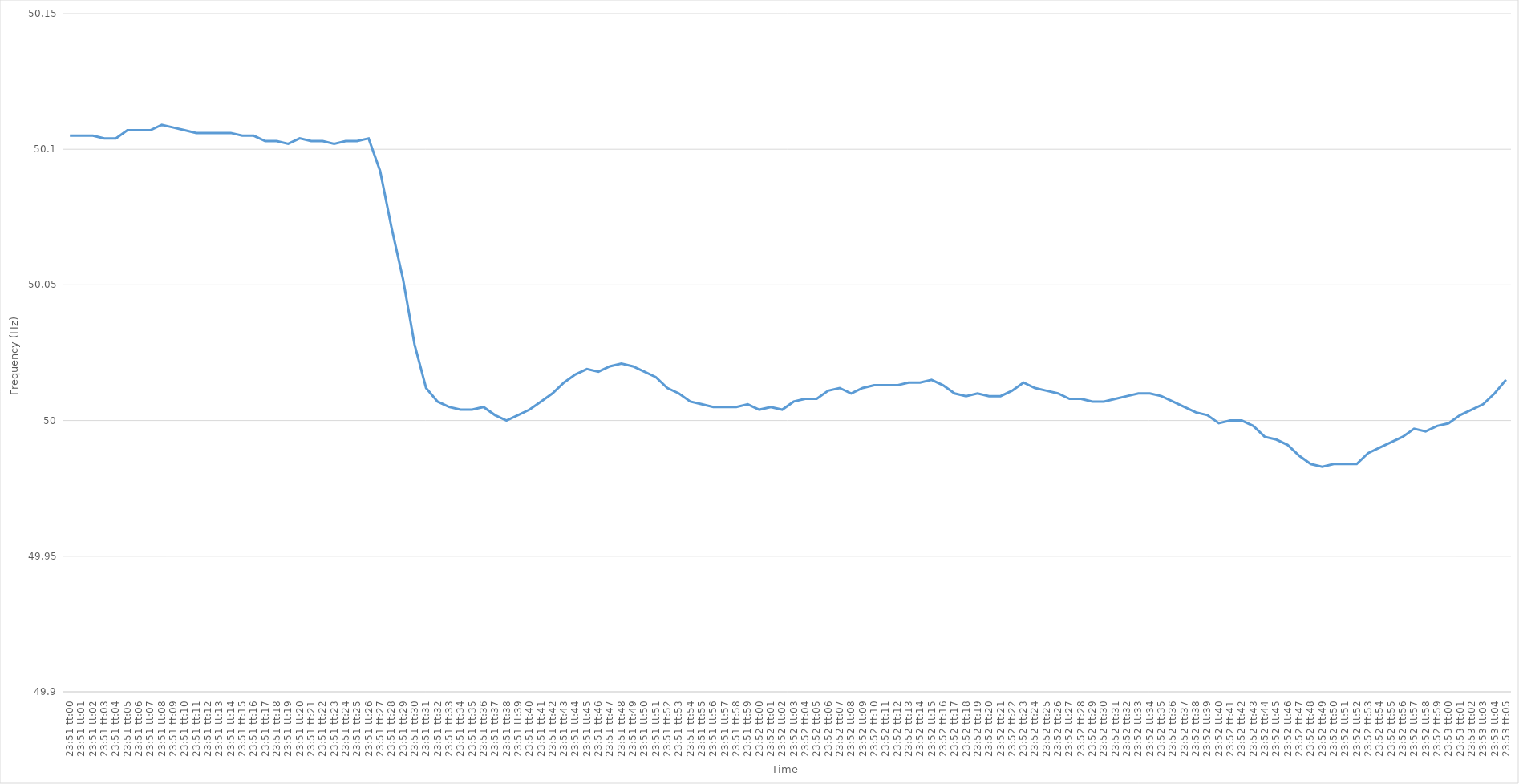
| Category | Series 0 |
|---|---|
| 0.99375 | 50.105 |
| 0.9937615740740741 | 50.105 |
| 0.9937731481481481 | 50.105 |
| 0.9937847222222222 | 50.104 |
| 0.9937962962962964 | 50.104 |
| 0.9938078703703703 | 50.107 |
| 0.9938194444444445 | 50.107 |
| 0.9938310185185185 | 50.107 |
| 0.9938425925925927 | 50.109 |
| 0.9938541666666666 | 50.108 |
| 0.9938657407407407 | 50.107 |
| 0.9938773148148149 | 50.106 |
| 0.9938888888888888 | 50.106 |
| 0.993900462962963 | 50.106 |
| 0.993912037037037 | 50.106 |
| 0.9939236111111112 | 50.105 |
| 0.9939351851851851 | 50.105 |
| 0.9939467592592592 | 50.103 |
| 0.9939583333333334 | 50.103 |
| 0.9939699074074074 | 50.102 |
| 0.9939814814814815 | 50.104 |
| 0.9939930555555555 | 50.103 |
| 0.9940046296296297 | 50.103 |
| 0.9940162037037038 | 50.102 |
| 0.9940277777777777 | 50.103 |
| 0.9940393518518519 | 50.103 |
| 0.9940509259259259 | 50.104 |
| 0.9940625000000001 | 50.092 |
| 0.994074074074074 | 50.071 |
| 0.9940856481481481 | 50.052 |
| 0.9940972222222223 | 50.028 |
| 0.9941087962962962 | 50.012 |
| 0.9941203703703704 | 50.007 |
| 0.9941319444444444 | 50.005 |
| 0.9941435185185186 | 50.004 |
| 0.9941550925925925 | 50.004 |
| 0.9941666666666666 | 50.005 |
| 0.9941782407407408 | 50.002 |
| 0.9941898148148148 | 50 |
| 0.9942013888888889 | 50.002 |
| 0.9942129629629629 | 50.004 |
| 0.9942245370370371 | 50.007 |
| 0.9942361111111112 | 50.01 |
| 0.9942476851851851 | 50.014 |
| 0.9942592592592593 | 50.017 |
| 0.9942708333333333 | 50.019 |
| 0.9942824074074075 | 50.018 |
| 0.9942939814814814 | 50.02 |
| 0.9943055555555556 | 50.021 |
| 0.9943171296296297 | 50.02 |
| 0.9943287037037036 | 50.018 |
| 0.9943402777777778 | 50.016 |
| 0.9943518518518518 | 50.012 |
| 0.994363425925926 | 50.01 |
| 0.9943749999999999 | 50.007 |
| 0.994386574074074 | 50.006 |
| 0.9943981481481482 | 50.005 |
| 0.9944097222222222 | 50.005 |
| 0.9944212962962963 | 50.005 |
| 0.9944328703703703 | 50.006 |
| 0.9944444444444445 | 50.004 |
| 0.9944560185185186 | 50.005 |
| 0.9944675925925925 | 50.004 |
| 0.9944791666666667 | 50.007 |
| 0.9944907407407407 | 50.008 |
| 0.9945023148148149 | 50.008 |
| 0.9945138888888888 | 50.011 |
| 0.994525462962963 | 50.012 |
| 0.9945370370370371 | 50.01 |
| 0.994548611111111 | 50.012 |
| 0.9945601851851852 | 50.013 |
| 0.9945717592592592 | 50.013 |
| 0.9945833333333334 | 50.013 |
| 0.9945949074074073 | 50.014 |
| 0.9946064814814815 | 50.014 |
| 0.9946180555555556 | 50.015 |
| 0.9946296296296296 | 50.013 |
| 0.9946412037037037 | 50.01 |
| 0.9946527777777777 | 50.009 |
| 0.9946643518518519 | 50.01 |
| 0.994675925925926 | 50.009 |
| 0.9946875 | 50.009 |
| 0.9946990740740741 | 50.011 |
| 0.9947106481481481 | 50.014 |
| 0.9947222222222223 | 50.012 |
| 0.9947337962962962 | 50.011 |
| 0.9947453703703704 | 50.01 |
| 0.9947569444444445 | 50.008 |
| 0.9947685185185186 | 50.008 |
| 0.9947800925925926 | 50.007 |
| 0.9947916666666666 | 50.007 |
| 0.9948032407407408 | 50.008 |
| 0.9948148148148147 | 50.009 |
| 0.9948263888888889 | 50.01 |
| 0.994837962962963 | 50.01 |
| 0.994849537037037 | 50.009 |
| 0.9948611111111111 | 50.007 |
| 0.9948726851851851 | 50.005 |
| 0.9948842592592593 | 50.003 |
| 0.9948958333333334 | 50.002 |
| 0.9949074074074074 | 49.999 |
| 0.9949189814814815 | 50 |
| 0.9949305555555555 | 50 |
| 0.9949421296296297 | 49.998 |
| 0.9949537037037036 | 49.994 |
| 0.9949652777777778 | 49.993 |
| 0.9949768518518519 | 49.991 |
| 0.994988425925926 | 49.987 |
| 0.995 | 49.984 |
| 0.995011574074074 | 49.983 |
| 0.9950231481481482 | 49.984 |
| 0.9950347222222223 | 49.984 |
| 0.9950462962962963 | 49.984 |
| 0.9950578703703704 | 49.988 |
| 0.9950694444444445 | 49.99 |
| 0.9950810185185185 | 49.992 |
| 0.9950925925925925 | 49.994 |
| 0.9951041666666667 | 49.997 |
| 0.9951157407407408 | 49.996 |
| 0.9951273148148148 | 49.998 |
| 0.9951388888888889 | 49.999 |
| 0.995150462962963 | 50.002 |
| 0.9951620370370371 | 50.004 |
| 0.995173611111111 | 50.006 |
| 0.9951851851851852 | 50.01 |
| 0.9951967592592593 | 50.015 |